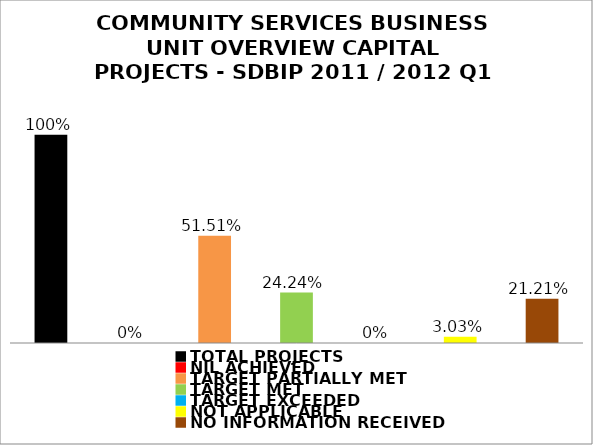
| Category | Series 1 |
|---|---|
| TOTAL PROJECTS | 1 |
| NIL ACHIEVED | 0 |
| TARGET PARTIALLY MET | 0.515 |
| TARGET MET | 0.242 |
| TARGET EXCEEDED | 0 |
| NOT APPLICABLE | 0.03 |
| NO INFORMATION RECEIVED | 0.212 |